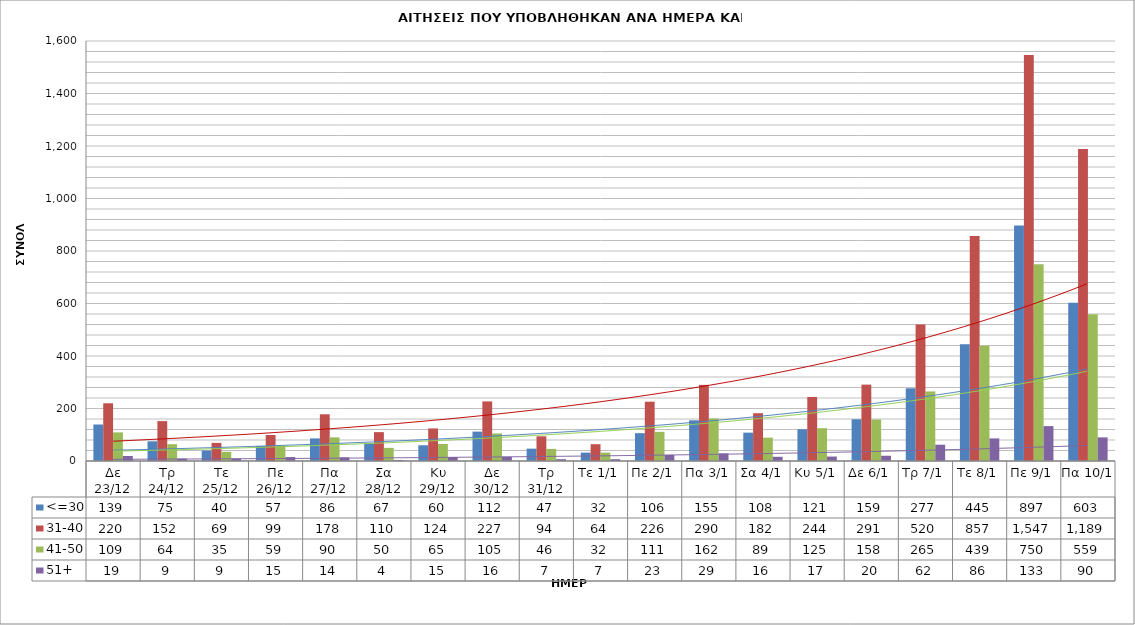
| Category | <=30 | 31-40 | 41-50 | 51+ |
|---|---|---|---|---|
| Δε 23/12 | 139 | 220 | 109 | 19 |
| Τρ 24/12 | 75 | 152 | 64 | 9 |
| Τε 25/12 | 40 | 69 | 35 | 9 |
| Πε 26/12 | 57 | 99 | 59 | 15 |
| Πα 27/12 | 86 | 178 | 90 | 14 |
| Σα 28/12 | 67 | 110 | 50 | 4 |
| Κυ 29/12 | 60 | 124 | 65 | 15 |
| Δε 30/12 | 112 | 227 | 105 | 16 |
| Τρ 31/12 | 47 | 94 | 46 | 7 |
| Τε 1/1 | 32 | 64 | 32 | 7 |
| Πε 2/1 | 106 | 226 | 111 | 23 |
| Πα 3/1 | 155 | 290 | 162 | 29 |
| Σα 4/1 | 108 | 182 | 89 | 16 |
| Κυ 5/1 | 121 | 244 | 125 | 17 |
| Δε 6/1 | 159 | 291 | 158 | 20 |
| Τρ 7/1 | 277 | 520 | 265 | 62 |
| Τε 8/1 | 445 | 857 | 439 | 86 |
| Πε 9/1 | 897 | 1547 | 750 | 133 |
| Πα 10/1 | 603 | 1189 | 559 | 90 |